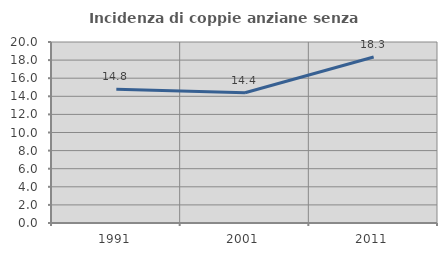
| Category | Incidenza di coppie anziane senza figli  |
|---|---|
| 1991.0 | 14.779 |
| 2001.0 | 14.394 |
| 2011.0 | 18.338 |